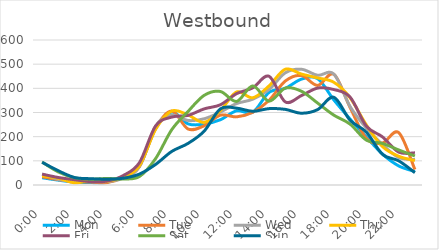
| Category | Mon | Tue | Wed | Thu | Fri | Sat | Sun |
|---|---|---|---|---|---|---|---|
| 0.0 | 30 | 34 | 45 | 38 | 45 | 95 | 94 |
| 0.041667 | 20 | 22 | 23 | 28 | 31 | 54 | 59 |
| 0.083333 | 12 | 15 | 15 | 9 | 22 | 30 | 31 |
| 0.125 | 10 | 12 | 14 | 18 | 14 | 24 | 26 |
| 0.166667 | 11 | 10 | 14 | 15 | 16 | 27 | 24 |
| 0.208333 | 34 | 31 | 28 | 33 | 39 | 25 | 28 |
| 0.25 | 78 | 76 | 75 | 79 | 92 | 35 | 45 |
| 0.291667 | 234 | 234 | 243 | 230 | 244 | 109 | 85 |
| 0.333333 | 302 | 306 | 289 | 306 | 281 | 229 | 139 |
| 0.375 | 253 | 232 | 267 | 290 | 288 | 304 | 172 |
| 0.416667 | 252 | 245 | 274 | 259 | 315 | 371 | 223 |
| 0.458333 | 270 | 289 | 302 | 308 | 332 | 387 | 315 |
| 0.5 | 307 | 282 | 337 | 385 | 378 | 346 | 318 |
| 0.541667 | 301 | 301 | 355 | 361 | 402 | 410 | 305 |
| 0.5833333333333334 | 383 | 350 | 395 | 410 | 450 | 347 | 316 |
| 0.625 | 400 | 430 | 464 | 479 | 344 | 401 | 313 |
| 0.666667 | 438 | 453 | 479 | 459 | 370 | 388 | 297 |
| 0.708333 | 440 | 412 | 454 | 443 | 401 | 339 | 312 |
| 0.75 | 352 | 458 | 459 | 425 | 395 | 289 | 363 |
| 0.791667 | 273 | 321 | 325 | 361 | 364 | 252 | 268 |
| 0.833333 | 199 | 193 | 236 | 249 | 244 | 186 | 219 |
| 0.875 | 128 | 174 | 167 | 159 | 199 | 172 | 127 |
| 0.916667 | 79 | 217 | 114 | 119 | 136 | 145 | 100 |
| 0.958333 | 56 | 64 | 105 | 101 | 133 | 120 | 51 |